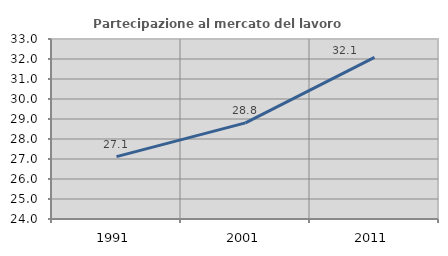
| Category | Partecipazione al mercato del lavoro  femminile |
|---|---|
| 1991.0 | 27.121 |
| 2001.0 | 28.809 |
| 2011.0 | 32.077 |